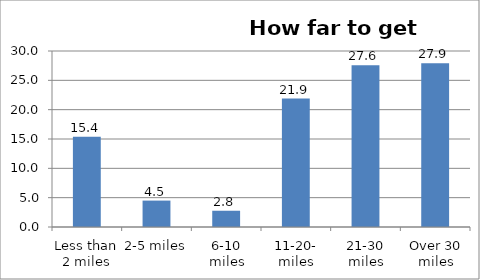
| Category | Series 0 |
|---|---|
| Less than 2 miles | 15.363 |
| 2-5 miles | 4.501 |
| 6-10 miles | 2.77 |
| 11-20- miles | 21.893 |
| 21-30 miles | 27.553 |
| Over 30 miles | 27.919 |